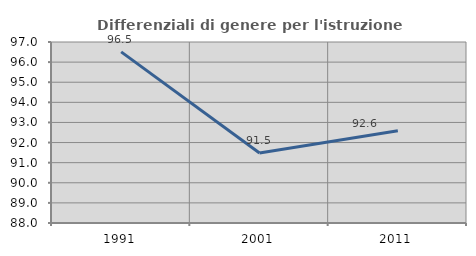
| Category | Differenziali di genere per l'istruzione superiore |
|---|---|
| 1991.0 | 96.51 |
| 2001.0 | 91.482 |
| 2011.0 | 92.59 |